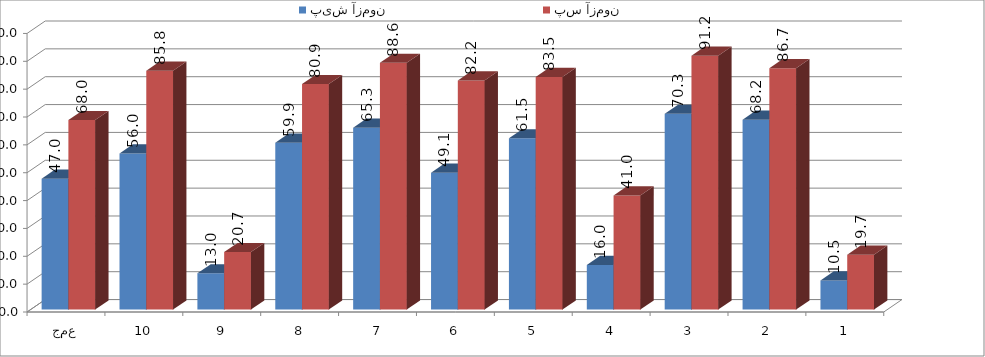
| Category | پیش آزمون | پس آزمون |
|---|---|---|
| 1 | 10.45 | 19.695 |
| 2 | 68.167 | 86.656 |
| 3 | 70.257 | 91.158 |
| 4 | 15.997 | 40.997 |
| 5 | 61.495 | 83.521 |
| 6 | 49.116 | 82.235 |
| 7 | 65.273 | 88.585 |
| 8 | 59.887 | 80.949 |
| 9 | 13.023 | 20.659 |
| 10 | 56.029 | 85.772 |
| جمع | 46.969 | 68.023 |